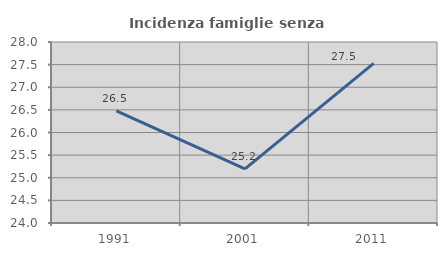
| Category | Incidenza famiglie senza nuclei |
|---|---|
| 1991.0 | 26.477 |
| 2001.0 | 25.196 |
| 2011.0 | 27.529 |